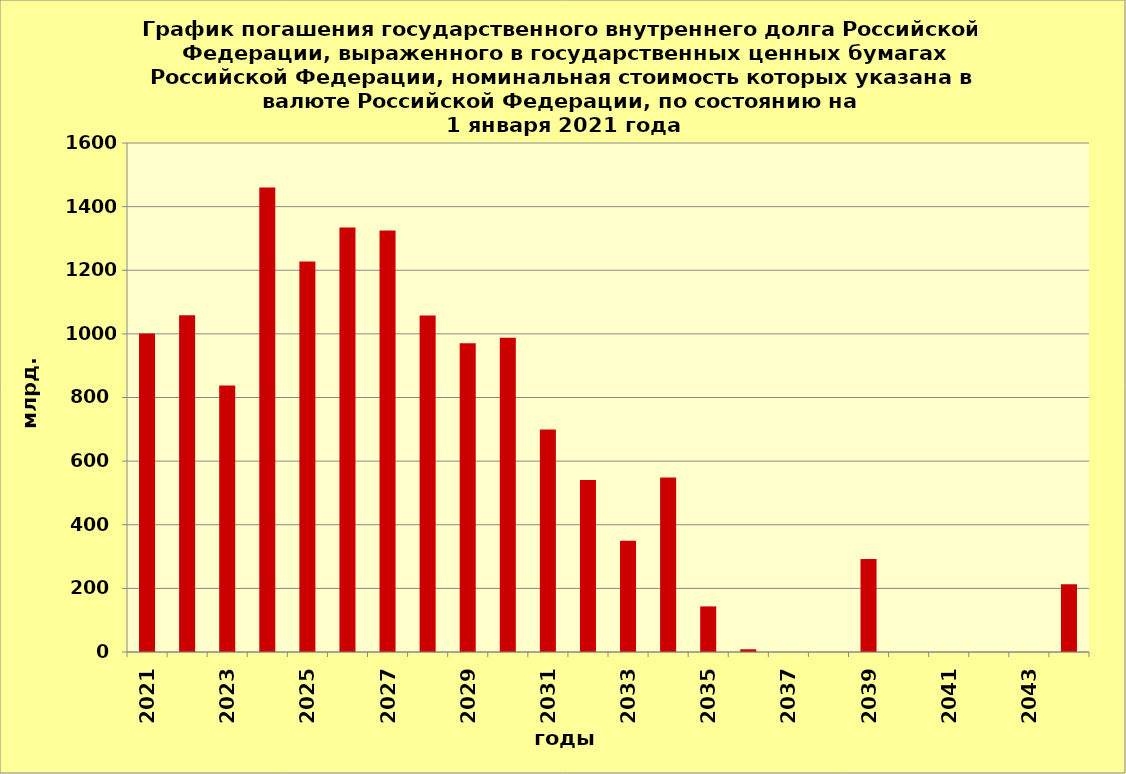
| Category | ряд 1 |
|---|---|
| 2021.0 | 1001.154 |
| 2022.0 | 1058.457 |
| 2023.0 | 837.4 |
| 2024.0 | 1459.927 |
| 2025.0 | 1227.867 |
| 2026.0 | 1334.561 |
| 2027.0 | 1324.833 |
| 2028.0 | 1057.975 |
| 2029.0 | 970.488 |
| 2030.0 | 987.733 |
| 2031.0 | 699.317 |
| 2032.0 | 540.894 |
| 2033.0 | 350 |
| 2034.0 | 548.84 |
| 2035.0 | 143.377 |
| 2036.0 | 8.553 |
| 2037.0 | 0 |
| 2038.0 | 0 |
| 2039.0 | 292.181 |
| 2040.0 | 0 |
| 2041.0 | 0 |
| 2042.0 | 0 |
| 2043.0 | 0 |
| 2044.0 | 212.636 |